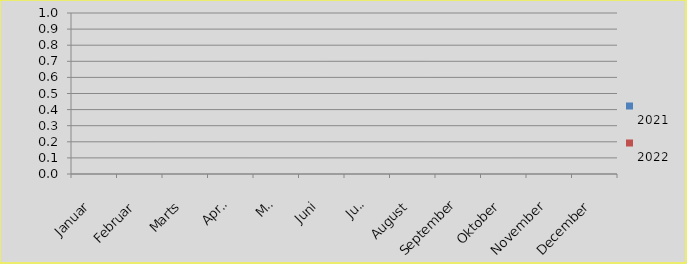
| Category | 
2021 | 
2022 |
|---|---|---|
| Januar |  | 0 |
| Februar |  | 0 |
| Marts |  | 0 |
| April |  | 0 |
| Maj |  | 0 |
| Juni |  | 0 |
| Juli |  | 0 |
| August |  | 0 |
| September |  | 0 |
| Oktober |  | 0 |
| November |  | 0 |
| December |  | 0 |